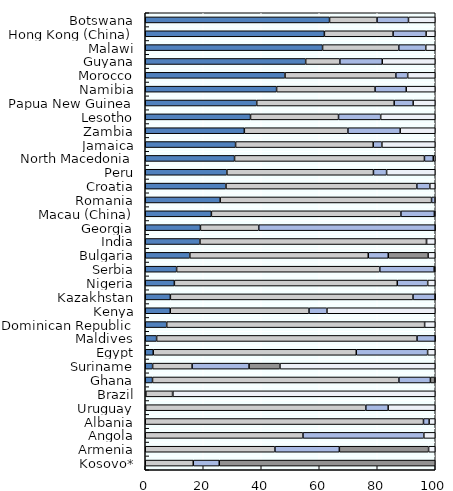
| Category | Equity | Bills and bonds | Cash and deposits | CIS (when look-through unavailable) | Other |
|---|---|---|---|---|---|
| Botswana | 63.547 | 16.38 | 10.839 | 0 | 9.233 |
| Hong Kong (China) | 61.768 | 23.695 | 11.388 | 0 | 3.15 |
| Malawi | 61.148 | 26.272 | 9.312 | 0 | 3.268 |
| Guyana | 55.321 | 11.791 | 14.615 | 0 | 18.273 |
| Morocco | 48.193 | 38.222 | 4.085 | 0 | 9.5 |
| Namibia | 45.295 | 33.955 | 10.734 | 0 | 10.016 |
| Papua New Guinea | 38.442 | 47.395 | 6.545 | 0 | 7.617 |
| Lesotho | 36.302 | 30.346 | 14.535 | 0 | 18.817 |
| Zambia | 34.166 | 35.718 | 18.024 | 0 | 12.092 |
| Jamaica | 31.152 | 47.459 | 2.985 | 0 | 18.404 |
| North Macedonia | 30.796 | 65.478 | 3.04 | 0 | 0.686 |
| Peru | 28.148 | 50.54 | 4.536 | 0 | 16.775 |
| Croatia | 27.836 | 65.814 | 4.486 | 0 | 1.865 |
| Romania | 25.84 | 72.887 | 1.144 | 0 | 0.129 |
| Macau (China) | 22.805 | 65.354 | 11.541 | 0 | 0.3 |
| Georgia | 19.028 | 20.109 | 60.858 | 0 | 0.004 |
| India | 18.86 | 78.1 | 0.057 | 0 | 2.983 |
| Bulgaria | 15.373 | 61.525 | 6.9 | 13.74 | 2.462 |
| Serbia | 10.814 | 70.067 | 18.747 | 0 | 0.372 |
| Nigeria | 10.043 | 76.861 | 10.489 | 0 | 2.607 |
| Kazakhstan | 8.663 | 83.661 | 7.616 | 0.02 | 0.041 |
| Kenya | 8.623 | 47.843 | 6.195 | 0 | 37.339 |
| Dominican Republic | 7.401 | 88.936 | 0.001 | 0 | 3.661 |
| Maldives | 3.92 | 89.797 | 6.283 | 0 | 0 |
| Egypt | 2.752 | 70.016 | 24.602 | 0 | 2.63 |
| Suriname | 2.539 | 13.623 | 19.633 | 10.664 | 53.542 |
| Ghana | 2.502 | 84.962 | 10.871 | 1.463 | 0.202 |
| Brazil | 0.213 | 9.209 | 0.112 | 0 | 90.467 |
| Uruguay | 0.117 | 75.94 | 7.708 | 0 | 16.234 |
| Albania | 0 | 95.945 | 1.953 | 0 | 2.102 |
| Angola | 0 | 54.387 | 41.682 | 0 | 3.931 |
| Armenia | 0 | 44.721 | 22.213 | 30.776 | 2.29 |
| Kosovo* | 0 | 16.558 | 8.963 | 74.479 | 0 |